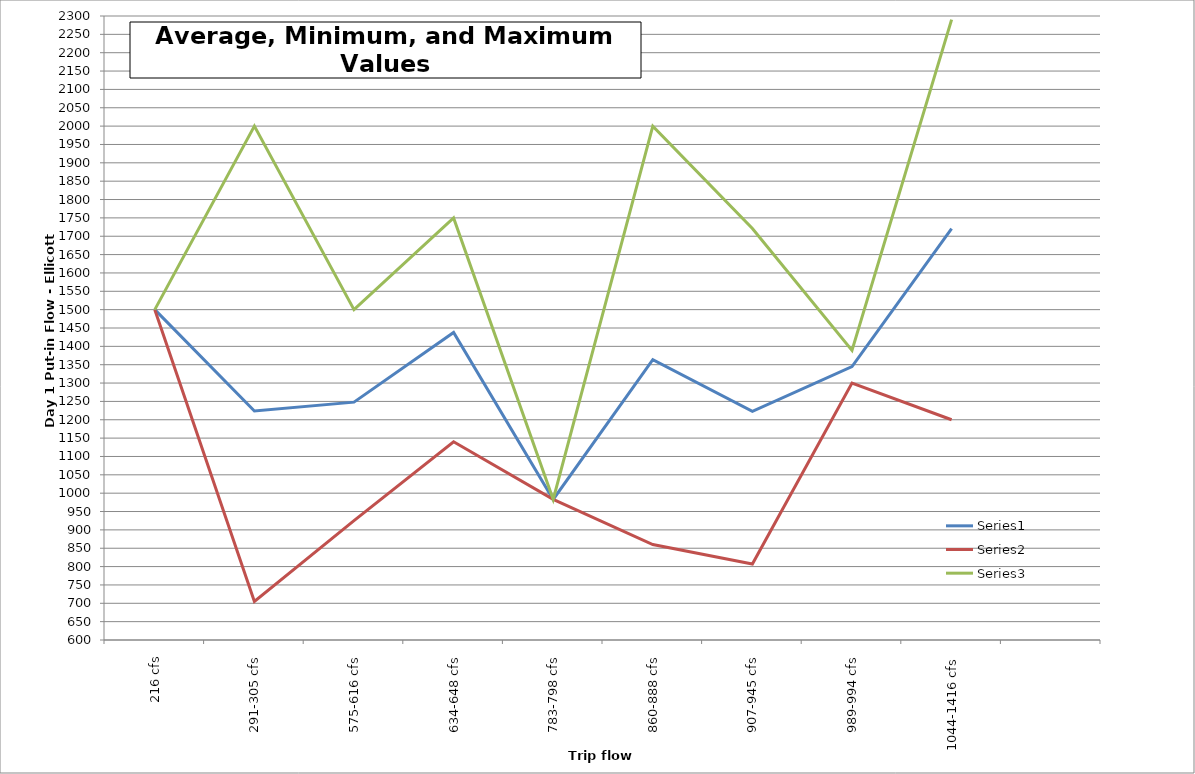
| Category | Series 0 | Series 1 | Series 2 |
|---|---|---|---|
| 216 cfs | 1500 | 1500 | 1500 |
| 291-305 cfs | 1224 | 705 | 2000 |
| 575-616 cfs | 1248 | 925 | 1500 |
| 634-648 cfs | 1438 | 1140 | 1750 |
| 783-798 cfs | 983 | 983 | 983 |
| 860-888 cfs | 1364 | 860 | 2000 |
| 907-945 cfs | 1223 | 807 | 1721 |
| 989-994 cfs | 1345 | 1300 | 1389 |
| 1044-1416 cfs | 1721 | 1200 | 2290 |